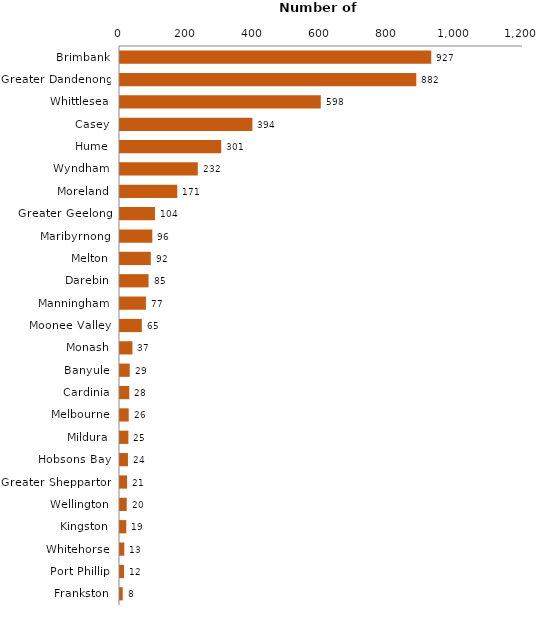
| Category | Municipality |
|---|---|
| Brimbank | 926.804 |
| Greater Dandenong | 882.294 |
| Whittlesea | 597.844 |
| Casey | 394.27 |
| Hume | 301.315 |
| Wyndham | 231.64 |
| Moreland | 170.623 |
| Greater Geelong | 104 |
| Maribyrnong | 96.223 |
| Melton | 91.665 |
| Darebin | 85 |
| Manningham | 77.17 |
| Moonee Valley | 64.946 |
| Monash | 37 |
| Banyule | 29 |
| Cardinia | 27.602 |
| Melbourne | 26 |
| Mildura | 25 |
| Hobsons Bay | 23.721 |
| Greater Shepparton | 21 |
| Wellington | 20 |
| Kingston | 18.706 |
| Whitehorse | 12.83 |
| Port Phillip | 12 |
| Frankston | 8.128 |